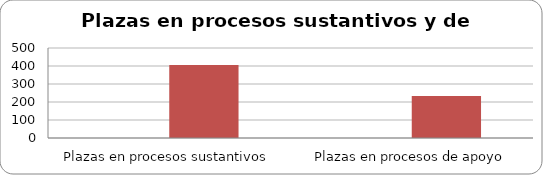
| Category | Series 0 | Series 1 |
|---|---|---|
| Plazas en procesos sustantivos |  | 406 |
| Plazas en procesos de apoyo |  | 233 |